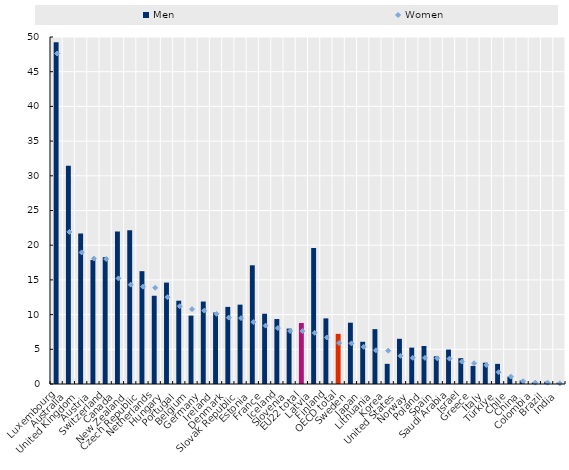
| Category | Men |
|---|---|
| Luxembourg | 49.245 |
| Australia | 31.446 |
| United Kingdom | 21.7 |
| Austria | 17.867 |
| Switzerland | 18.282 |
| Canada | 21.992 |
| New Zealand | 22.159 |
| Czech Republic | 16.259 |
| Netherlands | 12.714 |
| Hungary | 14.611 |
| Portugal | 12.003 |
| Belgium | 9.856 |
| Germany | 11.886 |
| Ireland | 10.304 |
| Denmark | 11.109 |
| Slovak Republic | 11.433 |
| Estonia | 17.107 |
| France | 10.122 |
| Iceland | 9.36 |
| Slovenia | 7.987 |
| EU22 total | 8.79 |
| Latvia | 19.591 |
| Finland | 9.455 |
| OECD total | 7.227 |
| Sweden | 8.833 |
| Japan | 6.084 |
| Lithuania | 7.905 |
| Korea | 2.903 |
| United States | 6.514 |
| Norway | 5.24 |
| Poland | 5.477 |
| Spain | 3.992 |
| Saudi Arabia | 4.958 |
| Israel | 3.722 |
| Greece | 2.602 |
| Italy | 3.069 |
| Türkiye | 2.899 |
| Chile | 1.045 |
| China | 0.502 |
| Colombia | 0.234 |
| Brazil | 0.326 |
| India | 0.18 |